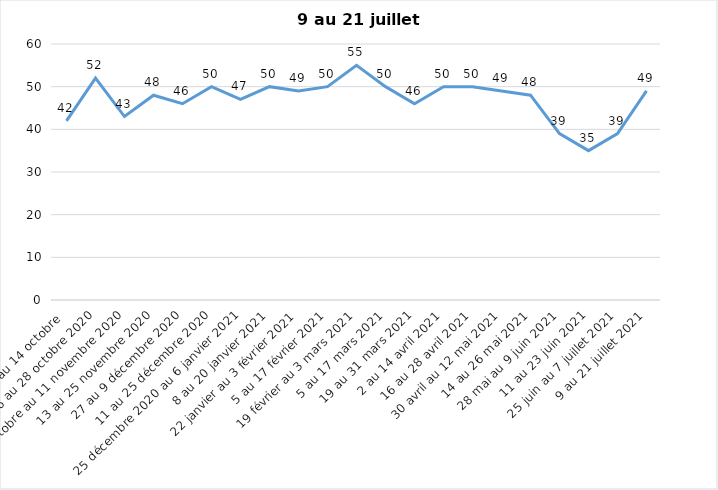
| Category | Toujours aux trois mesures |
|---|---|
| 2 au 14 octobre  | 42 |
| 16 au 28 octobre 2020 | 52 |
| 30 octobre au 11 novembre 2020 | 43 |
| 13 au 25 novembre 2020 | 48 |
| 27 au 9 décembre 2020 | 46 |
| 11 au 25 décembre 2020 | 50 |
| 25 décembre 2020 au 6 janvier 2021 | 47 |
| 8 au 20 janvier 2021 | 50 |
| 22 janvier au 3 février 2021 | 49 |
| 5 au 17 février 2021 | 50 |
| 19 février au 3 mars 2021 | 55 |
| 5 au 17 mars 2021 | 50 |
| 19 au 31 mars 2021 | 46 |
| 2 au 14 avril 2021 | 50 |
| 16 au 28 avril 2021 | 50 |
| 30 avril au 12 mai 2021 | 49 |
| 14 au 26 mai 2021 | 48 |
| 28 mai au 9 juin 2021 | 39 |
| 11 au 23 juin 2021 | 35 |
| 25 juin au 7 juillet 2021 | 39 |
| 9 au 21 juillet 2021 | 49 |